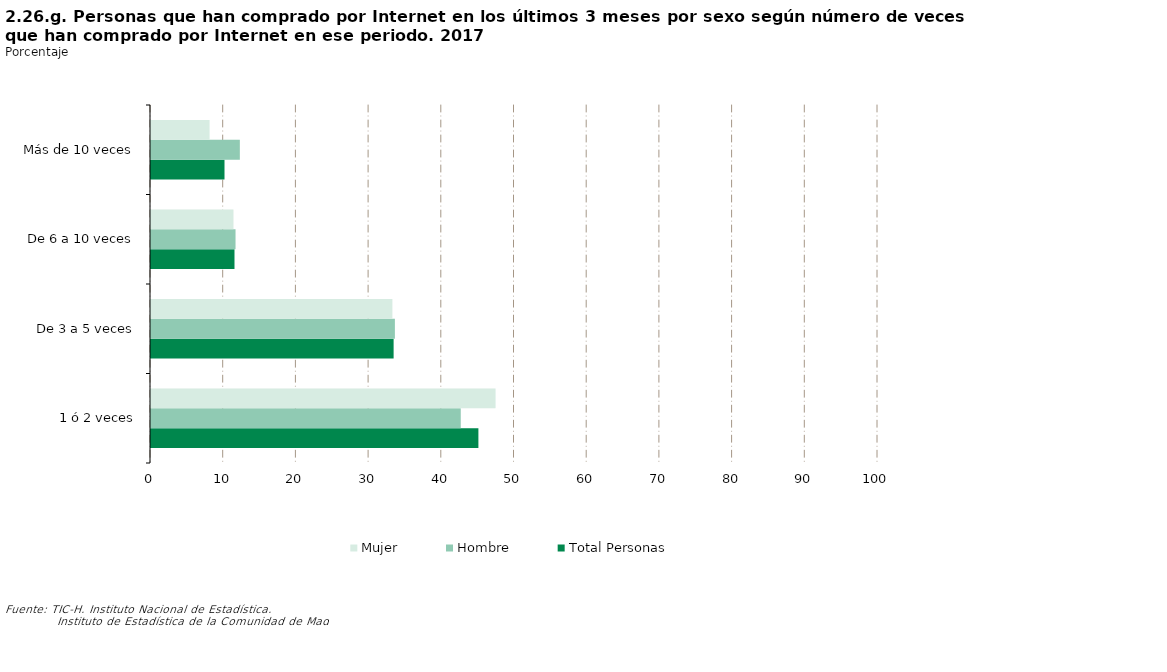
| Category | Total Personas | Hombre | Mujer |
|---|---|---|---|
| 1 ó 2 veces | 45.035 | 42.606 | 47.396 |
| De 3 a 5 veces | 33.372 | 33.547 | 33.201 |
| De 6 a 10 veces | 11.484 | 11.627 | 11.346 |
| Más de 10 veces | 10.11 | 12.22 | 8.058 |